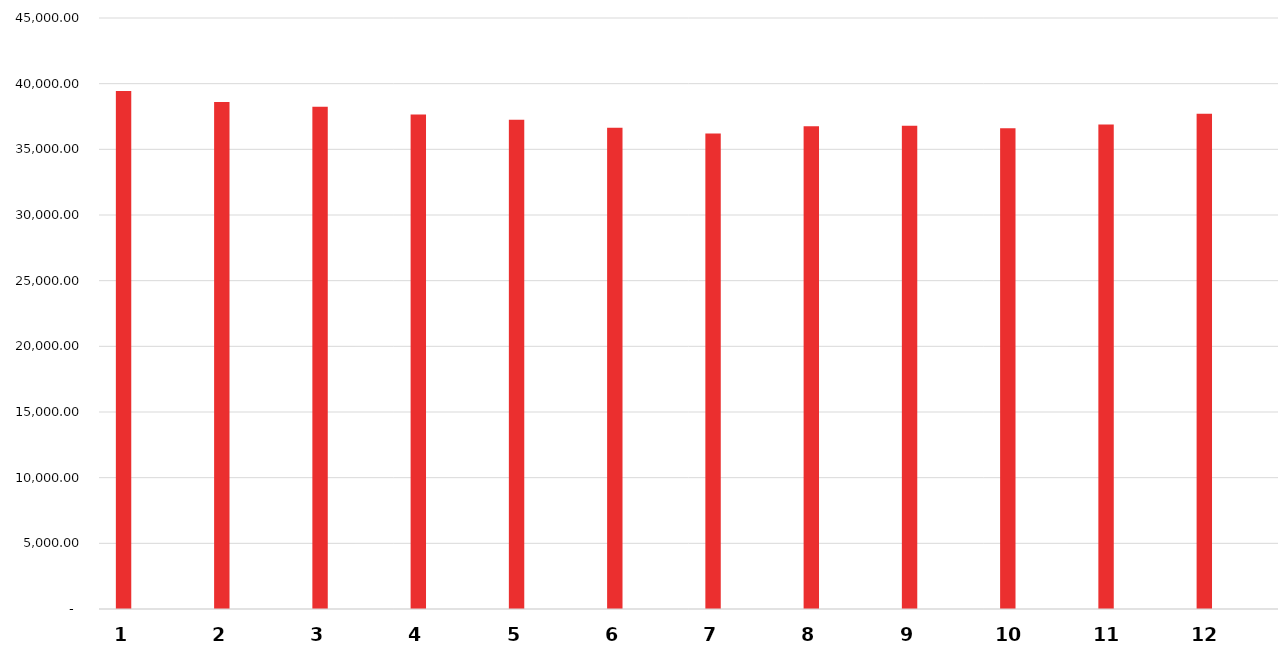
| Category | Series 0 |
|---|---|
| 1.0 | 39450 |
| nan | 0 |
| 2.0 | 38600 |
| nan | 0 |
| 3.0 | 38250 |
| nan | 0 |
| 4.0 | 37650 |
| nan | 0 |
| 5.0 | 37250 |
| nan | 0 |
| 6.0 | 36650 |
| nan | 0 |
| 7.0 | 36200 |
| nan | 0 |
| 8.0 | 36750 |
| nan | 0 |
| 9.0 | 36800 |
| nan | 0 |
| 10.0 | 36600 |
| nan | 0 |
| 11.0 | 36900 |
| nan | 0 |
| 12.0 | 37700 |
| nan | 0 |